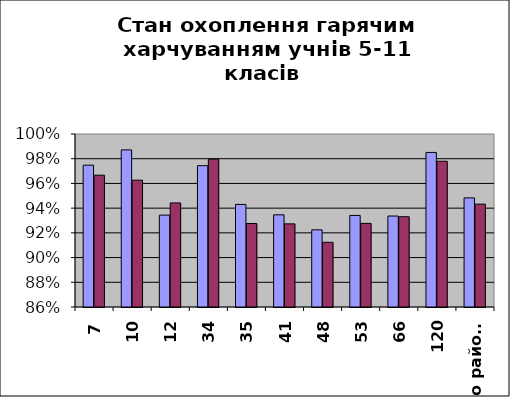
| Category | Series 0 | Series 1 |
|---|---|---|
| 7 | 0.975 | 0.967 |
| 10 | 0.987 | 0.963 |
| 12 | 0.934 | 0.944 |
| 34 | 0.974 | 0.98 |
| 35 | 0.943 | 0.928 |
| 41 | 0.935 | 0.927 |
| 48 | 0.922 | 0.912 |
| 53 | 0.934 | 0.928 |
| 66 | 0.934 | 0.933 |
| 120 | 0.985 | 0.978 |
| по району | 0.948 | 0.943 |